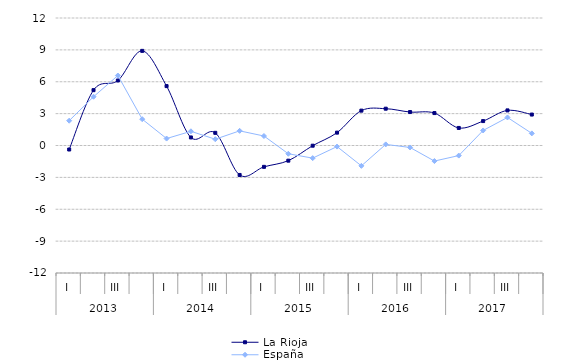
| Category | La Rioja  | España |
|---|---|---|
| 0 | -0.377 | 2.334 |
| 1 | 5.21 | 4.587 |
| 2 | 6.119 | 6.586 |
| 3 | 8.907 | 2.477 |
| 4 | 5.591 | 0.654 |
| 5 | 0.758 | 1.336 |
| 6 | 1.192 | 0.592 |
| 7 | -2.773 | 1.378 |
| 8 | -2.01 | 0.892 |
| 9 | -1.427 | -0.778 |
| 10 | -0.018 | -1.189 |
| 11 | 1.21 | -0.102 |
| 12 | 3.282 | -1.917 |
| 13 | 3.464 | 0.104 |
| 14 | 3.149 | -0.186 |
| 15 | 3.053 | -1.464 |
| 16 | 1.653 | -0.949 |
| 17 | 2.299 | 1.415 |
| 18 | 3.304 | 2.639 |
| 19 | 2.913 | 1.139 |